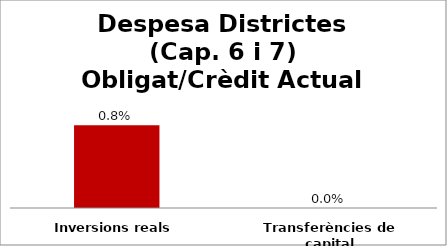
| Category | Series 0 |
|---|---|
| Inversions reals | 0.008 |
| Transferències de capital | 0 |